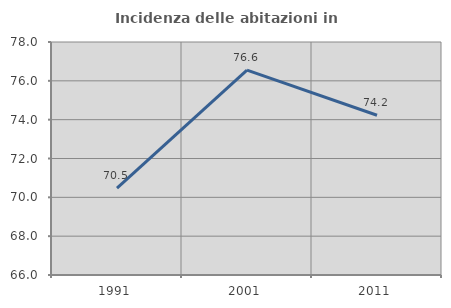
| Category | Incidenza delle abitazioni in proprietà  |
|---|---|
| 1991.0 | 70.472 |
| 2001.0 | 76.552 |
| 2011.0 | 74.226 |